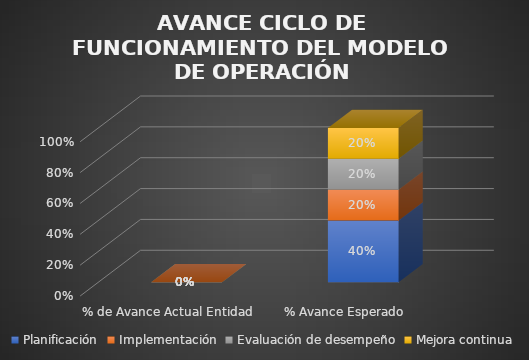
| Category | Planificación | Implementación | Evaluación de desempeño | Mejora continua |
|---|---|---|---|---|
| % de Avance Actual Entidad | 0 | 0 | 0 | 0 |
| % Avance Esperado | 0.4 | 0.2 | 0.2 | 0.2 |